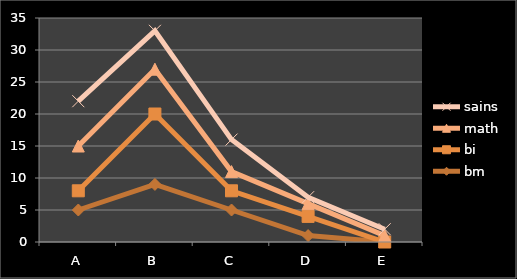
| Category | bm | bi | math | sains |
|---|---|---|---|---|
| A | 5 | 3 | 7 | 7 |
| B | 9 | 11 | 7 | 6 |
| C | 5 | 3 | 3 | 5 |
| D | 1 | 3 | 2 | 1 |
| E | 0 | 0 | 1 | 1 |